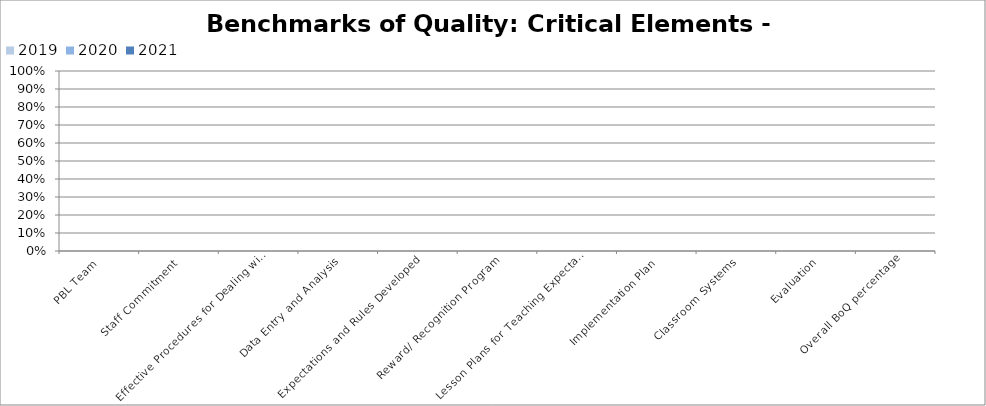
| Category | 2019 | 2020 | 2021 |
|---|---|---|---|
| PBL Team |  |  | 0 |
| Staff Commitment |  |  | 0 |
| Effective Procedures for Dealing with Discipline |  |  | 0 |
| Data Entry and Analysis |  |  | 0 |
| Expectations and Rules Developed |  |  | 0 |
| Reward/ Recognition Program |  |  | 0 |
| Lesson Plans for Teaching Expectations |  |  | 0 |
| Implementation Plan |  |  | 0 |
| Classroom Systems |  |  | 0 |
| Evaluation |  |  | 0 |
| Overall BoQ percentage |  |  | 0 |